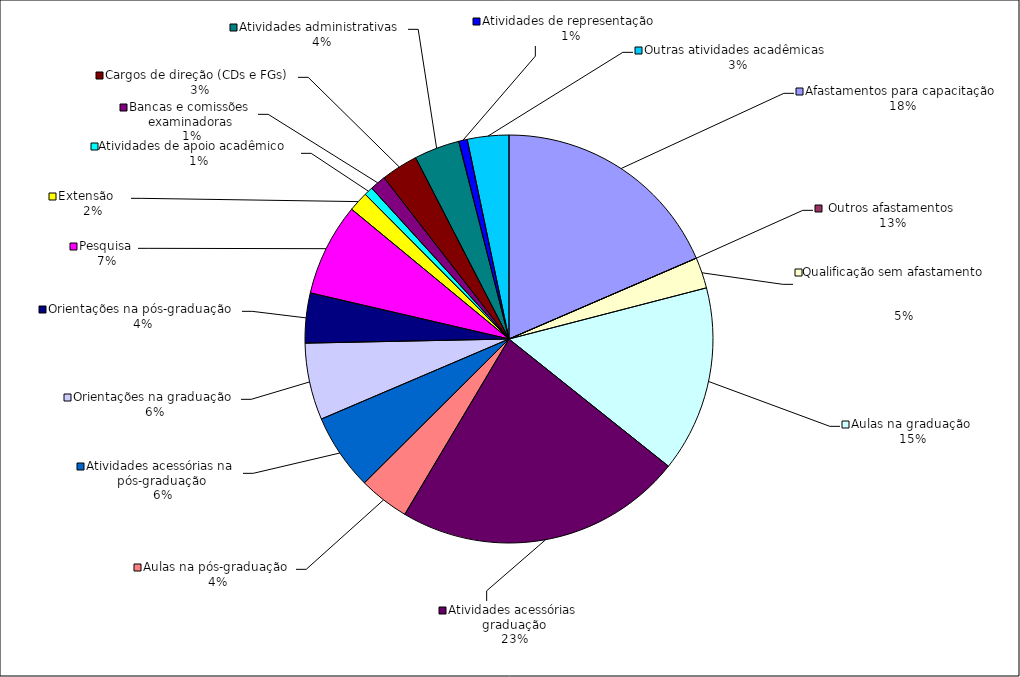
| Category | Series 0 |
|---|---|
| Afastamentos para capacitação | 5824 |
| Outros afastamentos | 0 |
| Qualificação sem afastamento                                                                     | 770 |
| Aulas na graduação | 4639 |
| Atividades acessórias graduação | 7179 |
| Aulas na pós-graduação | 1260 |
| Atividades acessórias na pós-graduação | 1900 |
| Orientações na graduação | 1916 |
| Orientações na pós-graduação | 1244 |
| Pesquisa | 2311 |
| Extensão    | 495 |
| Atividades de apoio acadêmico   | 220 |
| Bancas e comissões examinadoras | 396 |
| Cargos de direção (CDs e FGs) | 918 |
| Atividades administrativas | 1135 |
| Atividades de representação | 214 |
| Outras atividades acadêmicas | 1034 |